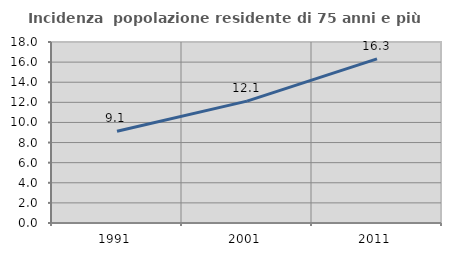
| Category | Incidenza  popolazione residente di 75 anni e più |
|---|---|
| 1991.0 | 9.117 |
| 2001.0 | 12.123 |
| 2011.0 | 16.326 |